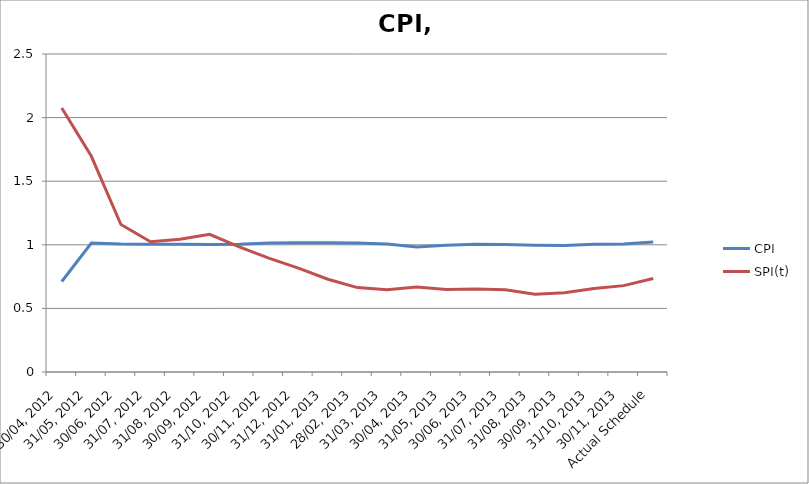
| Category | CPI | SPI(t) |
|---|---|---|
| 30/04, 2012 | 0.712 | 2.075 |
| 31/05, 2012 | 1.014 | 1.696 |
| 30/06, 2012 | 1.006 | 1.16 |
| 31/07, 2012 | 1.005 | 1.024 |
| 31/08, 2012 | 1.005 | 1.043 |
| 30/09, 2012 | 1.002 | 1.082 |
| 31/10, 2012 | 1.005 | 0.984 |
| 30/11, 2012 | 1.015 | 0.895 |
| 31/12, 2012 | 1.016 | 0.816 |
| 31/01, 2013 | 1.017 | 0.729 |
| 28/02, 2013 | 1.014 | 0.664 |
| 31/03, 2013 | 1.007 | 0.648 |
| 30/04, 2013 | 0.984 | 0.668 |
| 31/05, 2013 | 0.997 | 0.648 |
| 30/06, 2013 | 1.005 | 0.652 |
| 31/07, 2013 | 1.002 | 0.646 |
| 31/08, 2013 | 0.997 | 0.612 |
| 30/09, 2013 | 0.995 | 0.623 |
| 31/10, 2013 | 1.005 | 0.656 |
| 30/11, 2013 | 1.007 | 0.679 |
| Actual Schedule | 1.022 | 0.734 |